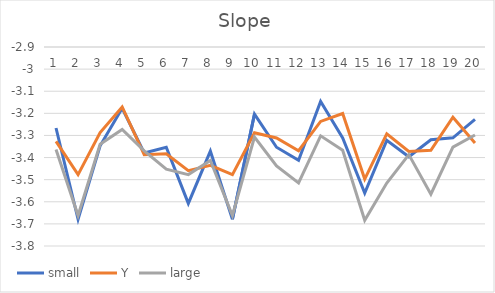
| Category | small | Y | large |
|---|---|---|---|
| 0 | -3.266 | -3.327 | -3.364 |
| 1 | -3.679 | -3.477 | -3.662 |
| 2 | -3.347 | -3.287 | -3.34 |
| 3 | -3.177 | -3.171 | -3.273 |
| 4 | -3.38 | -3.387 | -3.369 |
| 5 | -3.353 | -3.383 | -3.453 |
| 6 | -3.607 | -3.459 | -3.477 |
| 7 | -3.371 | -3.435 | -3.413 |
| 8 | -3.679 | -3.477 | -3.662 |
| 9 | -3.204 | -3.288 | -3.307 |
| 10 | -3.353 | -3.311 | -3.438 |
| 11 | -3.412 | -3.369 | -3.515 |
| 12 | -3.146 | -3.236 | -3.302 |
| 13 | -3.311 | -3.201 | -3.367 |
| 14 | -3.56 | -3.497 | -3.684 |
| 15 | -3.322 | -3.293 | -3.516 |
| 16 | -3.396 | -3.372 | -3.387 |
| 17 | -3.319 | -3.367 | -3.565 |
| 18 | -3.311 | -3.218 | -3.353 |
| 19 | -3.227 | -3.334 | -3.298 |